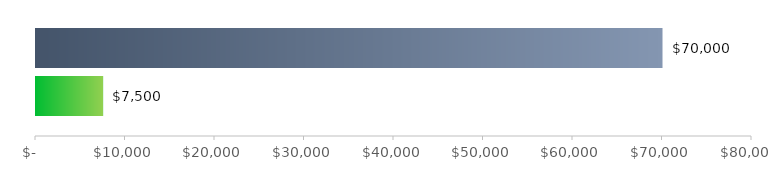
| Category | GESAMTFINANZIERUNG  | GESAMTAUSGABEN |
|---|---|---|
| 0 | 70000 | 7500 |